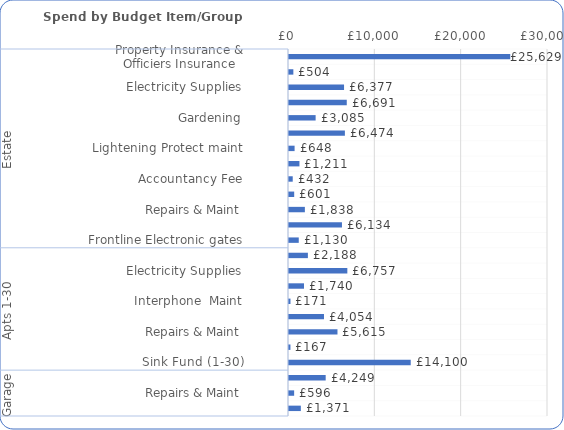
| Category | Total |
|---|---|
| 0 | 25628.86 |
| 1 | 503.8 |
| 2 | 6376.68 |
| 3 | 6690.76 |
| 4 | 3085 |
| 5 | 6474 |
| 6 | 648 |
| 7 | 1210.92 |
| 8 | 432 |
| 9 | 601.2 |
| 10 | 1838.15 |
| 11 | 6134 |
| 12 | 1129.69 |
| 13 | 2188.2 |
| 14 | 6756.68 |
| 15 | 1740 |
| 16 | 171 |
| 17 | 4053.5 |
| 18 | 5615.49 |
| 19 | 166.59 |
| 20 | 14100 |
| 21 | 4249.48 |
| 22 | 596.2 |
| 23 | 1371 |